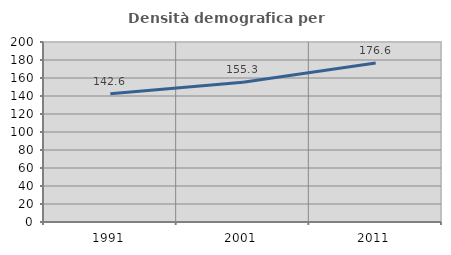
| Category | Densità demografica |
|---|---|
| 1991.0 | 142.576 |
| 2001.0 | 155.313 |
| 2011.0 | 176.562 |